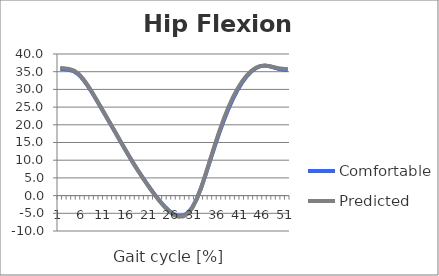
| Category | Comfortable | Predicted |
|---|---|---|
| 0 | 35.826 | 36.058 |
| 1 | 35.689 | 35.935 |
| 2 | 35.51 | 35.753 |
| 3 | 35.106 | 35.335 |
| 4 | 34.236 | 34.431 |
| 5 | 32.846 | 33.004 |
| 6 | 31.079 | 31.213 |
| 7 | 29.073 | 29.188 |
| 8 | 26.932 | 27.026 |
| 9 | 24.733 | 24.811 |
| 10 | 22.517 | 22.586 |
| 11 | 20.295 | 20.358 |
| 12 | 18.064 | 18.117 |
| 13 | 15.828 | 15.862 |
| 14 | 13.602 | 13.614 |
| 15 | 11.413 | 11.408 |
| 16 | 9.298 | 9.279 |
| 17 | 7.265 | 7.233 |
| 18 | 5.313 | 5.267 |
| 19 | 3.433 | 3.373 |
| 20 | 1.62 | 1.544 |
| 21 | -0.111 | -0.2 |
| 22 | -1.717 | -1.823 |
| 23 | -3.153 | -3.284 |
| 24 | -4.367 | -4.524 |
| 25 | -5.275 | -5.46 |
| 26 | -5.756 | -5.962 |
| 27 | -5.683 | -5.896 |
| 28 | -4.927 | -5.13 |
| 29 | -3.364 | -3.529 |
| 30 | -0.92 | -1.013 |
| 31 | 2.322 | 2.34 |
| 32 | 6.104 | 6.252 |
| 33 | 10.105 | 10.375 |
| 34 | 14.078 | 14.45 |
| 35 | 17.867 | 18.316 |
| 36 | 21.386 | 21.876 |
| 37 | 24.586 | 25.074 |
| 38 | 27.425 | 27.878 |
| 39 | 29.89 | 30.284 |
| 40 | 31.982 | 32.308 |
| 41 | 33.708 | 33.957 |
| 42 | 35.062 | 35.225 |
| 43 | 36.023 | 36.109 |
| 44 | 36.572 | 36.607 |
| 45 | 36.723 | 36.735 |
| 46 | 36.534 | 36.571 |
| 47 | 36.161 | 36.262 |
| 48 | 35.792 | 35.976 |
| 49 | 35.56 | 35.81 |
| 50 | 35.454 | 35.729 |